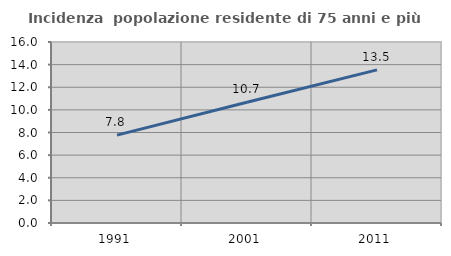
| Category | Incidenza  popolazione residente di 75 anni e più |
|---|---|
| 1991.0 | 7.765 |
| 2001.0 | 10.672 |
| 2011.0 | 13.538 |